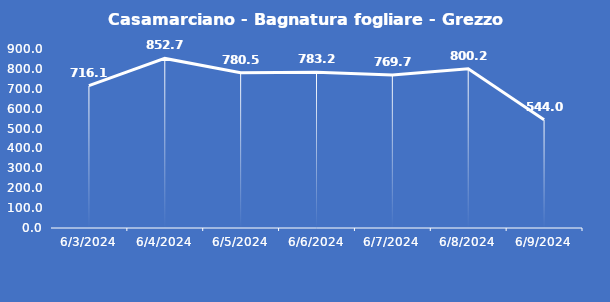
| Category | Casamarciano - Bagnatura fogliare - Grezzo (min) |
|---|---|
| 6/3/24 | 716.1 |
| 6/4/24 | 852.7 |
| 6/5/24 | 780.5 |
| 6/6/24 | 783.2 |
| 6/7/24 | 769.7 |
| 6/8/24 | 800.2 |
| 6/9/24 | 544 |